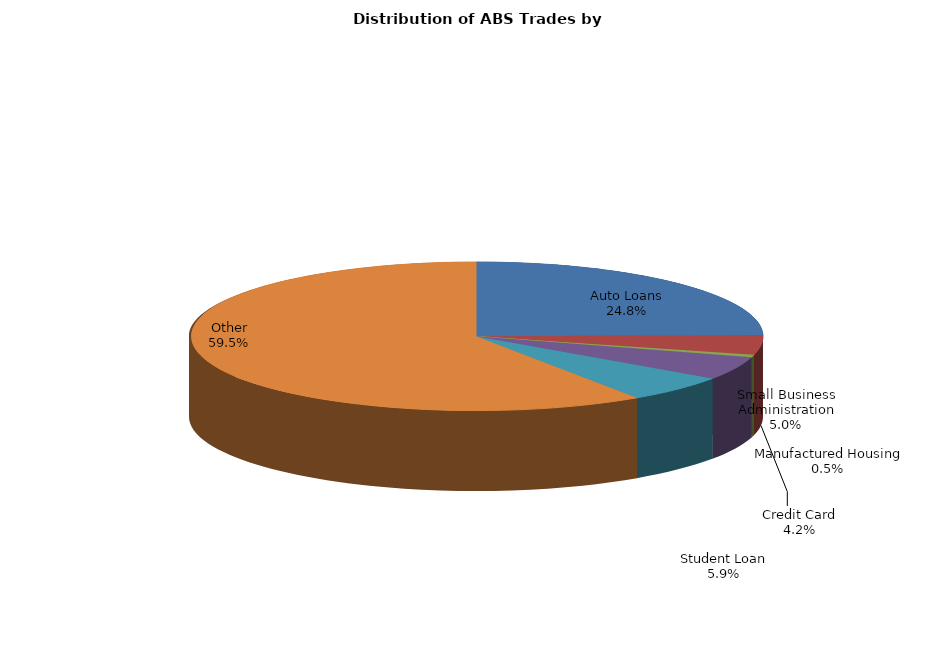
| Category | Series 0 |
|---|---|
| Auto Loans | 80.972 |
| Credit Card | 13.865 |
| Manufactured Housing | 1.79 |
| Small Business Administration | 16.48 |
| Student Loan | 19.393 |
| Other | 194.349 |